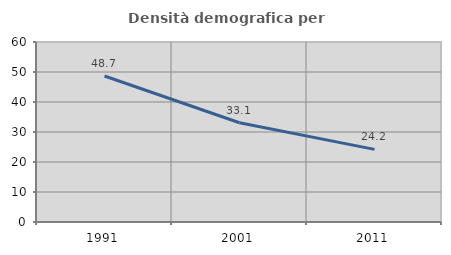
| Category | Densità demografica |
|---|---|
| 1991.0 | 48.656 |
| 2001.0 | 33.091 |
| 2011.0 | 24.213 |